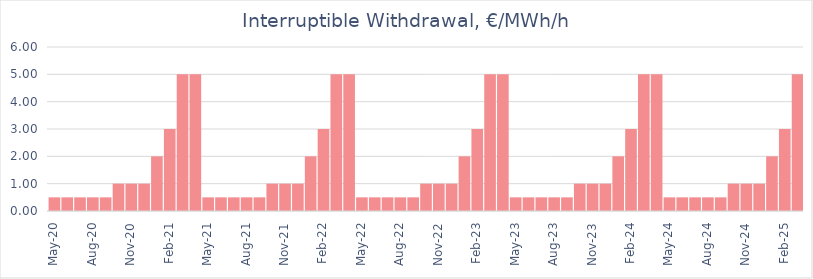
| Category | Price Pay-as-Used,  €/MWh/hour |
|---|---|
| 2020-05-01 | 0.5 |
| 2020-06-01 | 0.5 |
| 2020-07-01 | 0.5 |
| 2020-08-01 | 0.5 |
| 2020-09-01 | 0.5 |
| 2020-10-01 | 1 |
| 2020-11-01 | 1 |
| 2020-12-01 | 1 |
| 2021-01-01 | 2 |
| 2021-02-01 | 3 |
| 2021-03-01 | 5 |
| 2021-04-01 | 5 |
| 2021-05-01 | 0.5 |
| 2021-06-01 | 0.5 |
| 2021-07-01 | 0.5 |
| 2021-08-01 | 0.5 |
| 2021-09-01 | 0.5 |
| 2021-10-01 | 1 |
| 2021-11-01 | 1 |
| 2021-12-01 | 1 |
| 2022-01-01 | 2 |
| 2022-02-01 | 3 |
| 2022-03-01 | 5 |
| 2022-04-01 | 5 |
| 2022-05-01 | 0.5 |
| 2022-06-01 | 0.5 |
| 2022-07-01 | 0.5 |
| 2022-08-01 | 0.5 |
| 2022-09-01 | 0.5 |
| 2022-10-01 | 1 |
| 2022-11-01 | 1 |
| 2022-12-01 | 1 |
| 2023-01-01 | 2 |
| 2023-02-01 | 3 |
| 2023-03-01 | 5 |
| 2023-04-01 | 5 |
| 2023-05-01 | 0.5 |
| 2023-06-01 | 0.5 |
| 2023-07-01 | 0.5 |
| 2023-08-01 | 0.5 |
| 2023-09-01 | 0.5 |
| 2023-10-01 | 1 |
| 2023-11-01 | 1 |
| 2023-12-01 | 1 |
| 2024-01-01 | 2 |
| 2024-02-01 | 3 |
| 2024-03-01 | 5 |
| 2024-04-01 | 5 |
| 2024-05-01 | 0.5 |
| 2024-06-01 | 0.5 |
| 2024-07-01 | 0.5 |
| 2024-08-01 | 0.5 |
| 2024-09-01 | 0.5 |
| 2024-10-01 | 1 |
| 2024-11-01 | 1 |
| 2024-12-01 | 1 |
| 2025-01-01 | 2 |
| 2025-02-01 | 3 |
| 2025-03-01 | 5 |